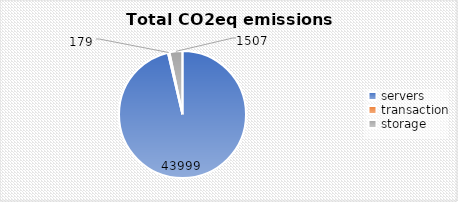
| Category | Series 0 |
|---|---|
| 0 | 43999.24 |
| 1 | 178.942 |
| 2 | 1506.777 |